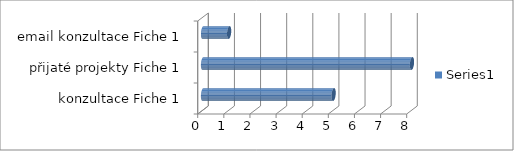
| Category | Series 0 |
|---|---|
|  konzultace Fiche 1 | 5 |
| přijaté projekty Fiche 1 | 8 |
| email konzultace Fiche 1 | 1 |